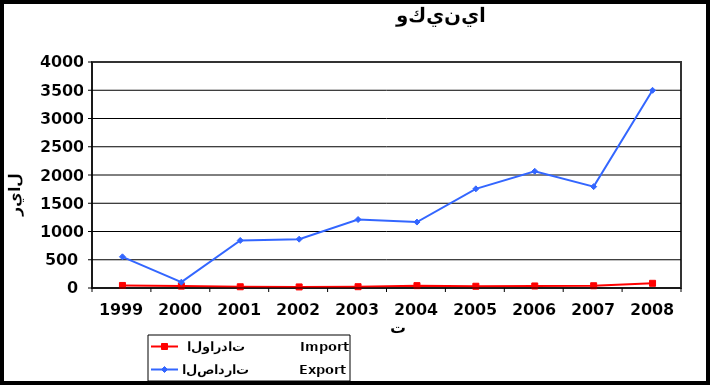
| Category |  الواردات           Import | الصادرات          Export |
|---|---|---|
| 1999.0 | 45 | 552 |
| 2000.0 | 34 | 103 |
| 2001.0 | 22 | 841 |
| 2002.0 | 19 | 864 |
| 2003.0 | 23 | 1212 |
| 2004.0 | 42 | 1167 |
| 2005.0 | 31 | 1755 |
| 2006.0 | 36 | 2066 |
| 2007.0 | 40 | 1794 |
| 2008.0 | 83 | 3499 |